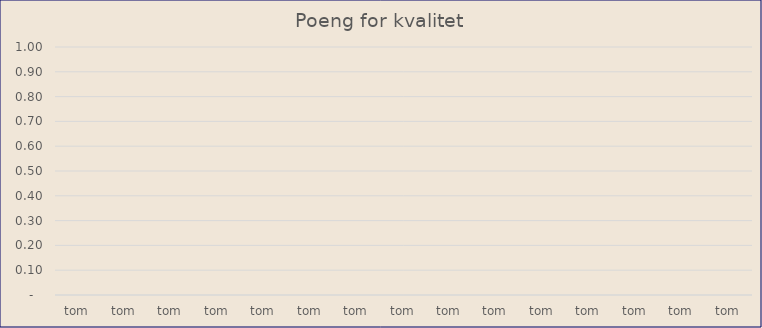
| Category | Poeng for kvalitet |
|---|---|
|  tom  | 0 |
|  tom  | 0 |
|  tom  | 0 |
|  tom  | 0 |
|  tom  | 0 |
|  tom  | 0 |
|  tom  | 0 |
|  tom  | 0 |
|  tom  | 0 |
|  tom  | 0 |
|  tom  | 0 |
|  tom  | 0 |
|  tom  | 0 |
|  tom  | 0 |
|  tom  | 0 |